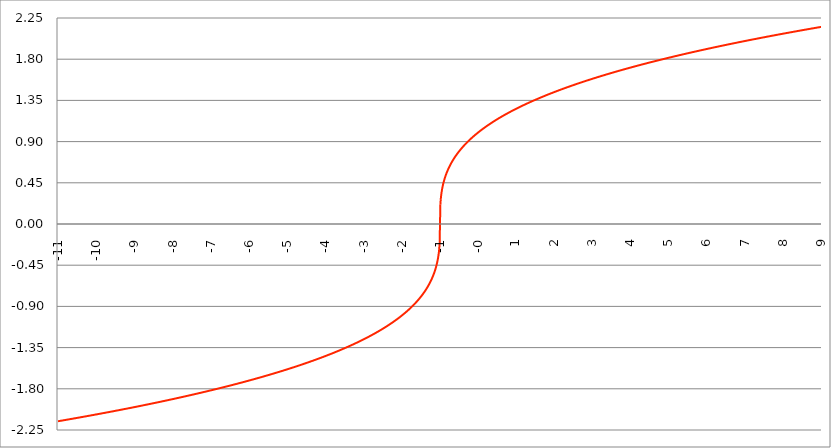
| Category | Series 1 |
|---|---|
| -11.0 | -2.154 |
| -10.99 | -2.154 |
| -10.98 | -2.153 |
| -10.97 | -2.152 |
| -10.96 | -2.152 |
| -10.95 | -2.151 |
| -10.94 | -2.15 |
| -10.93 | -2.149 |
| -10.92 | -2.149 |
| -10.91 | -2.148 |
| -10.9 | -2.147 |
| -10.89 | -2.147 |
| -10.88 | -2.146 |
| -10.87 | -2.145 |
| -10.86 | -2.144 |
| -10.85 | -2.144 |
| -10.84 | -2.143 |
| -10.83 | -2.142 |
| -10.82 | -2.141 |
| -10.81 | -2.141 |
| -10.8 | -2.14 |
| -10.79 | -2.139 |
| -10.78 | -2.139 |
| -10.77 | -2.138 |
| -10.76000000000001 | -2.137 |
| -10.75000000000001 | -2.136 |
| -10.74000000000001 | -2.136 |
| -10.73000000000001 | -2.135 |
| -10.72000000000001 | -2.134 |
| -10.71000000000001 | -2.133 |
| -10.70000000000001 | -2.133 |
| -10.69000000000001 | -2.132 |
| -10.68000000000001 | -2.131 |
| -10.67000000000001 | -2.13 |
| -10.66000000000001 | -2.13 |
| -10.65000000000001 | -2.129 |
| -10.64000000000001 | -2.128 |
| -10.63000000000001 | -2.128 |
| -10.62000000000001 | -2.127 |
| -10.61000000000001 | -2.126 |
| -10.60000000000001 | -2.125 |
| -10.59000000000001 | -2.125 |
| -10.58000000000001 | -2.124 |
| -10.57000000000001 | -2.123 |
| -10.56000000000001 | -2.122 |
| -10.55000000000001 | -2.122 |
| -10.54000000000001 | -2.121 |
| -10.53000000000001 | -2.12 |
| -10.52000000000001 | -2.119 |
| -10.51000000000001 | -2.119 |
| -10.50000000000001 | -2.118 |
| -10.49000000000001 | -2.117 |
| -10.48000000000001 | -2.116 |
| -10.47000000000001 | -2.116 |
| -10.46000000000001 | -2.115 |
| -10.45000000000001 | -2.114 |
| -10.44000000000001 | -2.113 |
| -10.43000000000001 | -2.113 |
| -10.42000000000001 | -2.112 |
| -10.41000000000001 | -2.111 |
| -10.40000000000001 | -2.11 |
| -10.39000000000001 | -2.11 |
| -10.38000000000001 | -2.109 |
| -10.37000000000001 | -2.108 |
| -10.36000000000001 | -2.107 |
| -10.35000000000001 | -2.107 |
| -10.34000000000001 | -2.106 |
| -10.33000000000001 | -2.105 |
| -10.32000000000001 | -2.104 |
| -10.31000000000001 | -2.104 |
| -10.30000000000001 | -2.103 |
| -10.29000000000002 | -2.102 |
| -10.28000000000002 | -2.101 |
| -10.27000000000002 | -2.101 |
| -10.26000000000002 | -2.1 |
| -10.25000000000002 | -2.099 |
| -10.24000000000002 | -2.098 |
| -10.23000000000002 | -2.098 |
| -10.22000000000002 | -2.097 |
| -10.21000000000002 | -2.096 |
| -10.20000000000002 | -2.095 |
| -10.19000000000002 | -2.095 |
| -10.18000000000002 | -2.094 |
| -10.17000000000002 | -2.093 |
| -10.16000000000002 | -2.092 |
| -10.15000000000002 | -2.092 |
| -10.14000000000002 | -2.091 |
| -10.13000000000002 | -2.09 |
| -10.12000000000002 | -2.089 |
| -10.11000000000002 | -2.089 |
| -10.10000000000002 | -2.088 |
| -10.09000000000002 | -2.087 |
| -10.08000000000002 | -2.086 |
| -10.07000000000002 | -2.085 |
| -10.06000000000002 | -2.085 |
| -10.05000000000002 | -2.084 |
| -10.04000000000002 | -2.083 |
| -10.03000000000002 | -2.082 |
| -10.02000000000002 | -2.082 |
| -10.01000000000002 | -2.081 |
| -10.00000000000002 | -2.08 |
| -9.990000000000022 | -2.079 |
| -9.980000000000022 | -2.079 |
| -9.97000000000002 | -2.078 |
| -9.960000000000022 | -2.077 |
| -9.950000000000022 | -2.076 |
| -9.940000000000023 | -2.075 |
| -9.930000000000023 | -2.075 |
| -9.920000000000023 | -2.074 |
| -9.910000000000023 | -2.073 |
| -9.900000000000023 | -2.072 |
| -9.890000000000024 | -2.072 |
| -9.880000000000024 | -2.071 |
| -9.870000000000024 | -2.07 |
| -9.860000000000024 | -2.069 |
| -9.850000000000025 | -2.068 |
| -9.840000000000025 | -2.068 |
| -9.830000000000025 | -2.067 |
| -9.820000000000025 | -2.066 |
| -9.810000000000025 | -2.065 |
| -9.800000000000026 | -2.065 |
| -9.790000000000026 | -2.064 |
| -9.780000000000026 | -2.063 |
| -9.770000000000026 | -2.062 |
| -9.760000000000026 | -2.061 |
| -9.750000000000027 | -2.061 |
| -9.740000000000027 | -2.06 |
| -9.730000000000027 | -2.059 |
| -9.720000000000027 | -2.058 |
| -9.710000000000027 | -2.057 |
| -9.700000000000028 | -2.057 |
| -9.690000000000028 | -2.056 |
| -9.680000000000028 | -2.055 |
| -9.670000000000028 | -2.054 |
| -9.660000000000029 | -2.054 |
| -9.650000000000029 | -2.053 |
| -9.640000000000029 | -2.052 |
| -9.63000000000003 | -2.051 |
| -9.62000000000003 | -2.05 |
| -9.61000000000003 | -2.05 |
| -9.60000000000003 | -2.049 |
| -9.59000000000003 | -2.048 |
| -9.58000000000003 | -2.047 |
| -9.57000000000003 | -2.046 |
| -9.56000000000003 | -2.046 |
| -9.55000000000003 | -2.045 |
| -9.540000000000031 | -2.044 |
| -9.530000000000031 | -2.043 |
| -9.520000000000032 | -2.042 |
| -9.510000000000032 | -2.042 |
| -9.50000000000003 | -2.041 |
| -9.490000000000032 | -2.04 |
| -9.480000000000032 | -2.039 |
| -9.470000000000033 | -2.038 |
| -9.460000000000033 | -2.038 |
| -9.450000000000033 | -2.037 |
| -9.440000000000033 | -2.036 |
| -9.430000000000033 | -2.035 |
| -9.420000000000034 | -2.034 |
| -9.410000000000032 | -2.034 |
| -9.400000000000034 | -2.033 |
| -9.390000000000034 | -2.032 |
| -9.380000000000035 | -2.031 |
| -9.370000000000035 | -2.03 |
| -9.360000000000033 | -2.03 |
| -9.350000000000035 | -2.029 |
| -9.340000000000035 | -2.028 |
| -9.330000000000036 | -2.027 |
| -9.320000000000036 | -2.026 |
| -9.310000000000034 | -2.026 |
| -9.300000000000036 | -2.025 |
| -9.290000000000036 | -2.024 |
| -9.280000000000037 | -2.023 |
| -9.270000000000037 | -2.022 |
| -9.260000000000037 | -2.021 |
| -9.250000000000037 | -2.021 |
| -9.240000000000038 | -2.02 |
| -9.230000000000038 | -2.019 |
| -9.220000000000038 | -2.018 |
| -9.210000000000038 | -2.017 |
| -9.200000000000038 | -2.017 |
| -9.190000000000039 | -2.016 |
| -9.180000000000039 | -2.015 |
| -9.170000000000037 | -2.014 |
| -9.16000000000004 | -2.013 |
| -9.15000000000004 | -2.012 |
| -9.14000000000004 | -2.012 |
| -9.13000000000004 | -2.011 |
| -9.12000000000004 | -2.01 |
| -9.11000000000004 | -2.009 |
| -9.10000000000004 | -2.008 |
| -9.09000000000004 | -2.007 |
| -9.08000000000004 | -2.007 |
| -9.07000000000004 | -2.006 |
| -9.06000000000004 | -2.005 |
| -9.05000000000004 | -2.004 |
| -9.040000000000042 | -2.003 |
| -9.03000000000004 | -2.002 |
| -9.020000000000042 | -2.002 |
| -9.010000000000042 | -2.001 |
| -9.000000000000043 | -2 |
| -8.990000000000043 | -1.999 |
| -8.980000000000043 | -1.998 |
| -8.970000000000043 | -1.997 |
| -8.960000000000043 | -1.997 |
| -8.950000000000044 | -1.996 |
| -8.940000000000042 | -1.995 |
| -8.930000000000044 | -1.994 |
| -8.920000000000044 | -1.993 |
| -8.910000000000045 | -1.992 |
| -8.900000000000045 | -1.992 |
| -8.890000000000043 | -1.991 |
| -8.880000000000045 | -1.99 |
| -8.870000000000045 | -1.989 |
| -8.860000000000046 | -1.988 |
| -8.850000000000046 | -1.987 |
| -8.840000000000044 | -1.987 |
| -8.830000000000046 | -1.986 |
| -8.820000000000046 | -1.985 |
| -8.810000000000047 | -1.984 |
| -8.800000000000045 | -1.983 |
| -8.790000000000047 | -1.982 |
| -8.780000000000047 | -1.981 |
| -8.770000000000048 | -1.981 |
| -8.760000000000048 | -1.98 |
| -8.750000000000046 | -1.979 |
| -8.740000000000048 | -1.978 |
| -8.730000000000048 | -1.977 |
| -8.720000000000049 | -1.976 |
| -8.710000000000049 | -1.976 |
| -8.700000000000047 | -1.975 |
| -8.69000000000005 | -1.974 |
| -8.68000000000005 | -1.973 |
| -8.67000000000005 | -1.972 |
| -8.66000000000005 | -1.971 |
| -8.65000000000005 | -1.97 |
| -8.64000000000005 | -1.97 |
| -8.63000000000005 | -1.969 |
| -8.62000000000005 | -1.968 |
| -8.610000000000051 | -1.967 |
| -8.600000000000051 | -1.966 |
| -8.590000000000051 | -1.965 |
| -8.580000000000052 | -1.964 |
| -8.570000000000052 | -1.964 |
| -8.560000000000052 | -1.963 |
| -8.550000000000052 | -1.962 |
| -8.540000000000052 | -1.961 |
| -8.530000000000053 | -1.96 |
| -8.520000000000053 | -1.959 |
| -8.510000000000053 | -1.958 |
| -8.500000000000053 | -1.957 |
| -8.490000000000054 | -1.957 |
| -8.480000000000054 | -1.956 |
| -8.470000000000052 | -1.955 |
| -8.460000000000054 | -1.954 |
| -8.450000000000054 | -1.953 |
| -8.440000000000055 | -1.952 |
| -8.430000000000055 | -1.951 |
| -8.420000000000055 | -1.95 |
| -8.410000000000055 | -1.95 |
| -8.400000000000055 | -1.949 |
| -8.390000000000056 | -1.948 |
| -8.380000000000056 | -1.947 |
| -8.370000000000056 | -1.946 |
| -8.360000000000056 | -1.945 |
| -8.350000000000056 | -1.944 |
| -8.340000000000057 | -1.943 |
| -8.330000000000057 | -1.943 |
| -8.320000000000057 | -1.942 |
| -8.310000000000057 | -1.941 |
| -8.300000000000058 | -1.94 |
| -8.290000000000058 | -1.939 |
| -8.280000000000058 | -1.938 |
| -8.270000000000058 | -1.937 |
| -8.260000000000058 | -1.936 |
| -8.250000000000059 | -1.935 |
| -8.240000000000059 | -1.935 |
| -8.230000000000059 | -1.934 |
| -8.22000000000006 | -1.933 |
| -8.21000000000006 | -1.932 |
| -8.20000000000006 | -1.931 |
| -8.19000000000006 | -1.93 |
| -8.18000000000006 | -1.929 |
| -8.17000000000006 | -1.928 |
| -8.16000000000006 | -1.927 |
| -8.15000000000006 | -1.926 |
| -8.140000000000061 | -1.926 |
| -8.130000000000061 | -1.925 |
| -8.120000000000061 | -1.924 |
| -8.110000000000062 | -1.923 |
| -8.100000000000062 | -1.922 |
| -8.090000000000062 | -1.921 |
| -8.080000000000062 | -1.92 |
| -8.070000000000062 | -1.919 |
| -8.060000000000063 | -1.918 |
| -8.050000000000063 | -1.917 |
| -8.040000000000063 | -1.917 |
| -8.030000000000063 | -1.916 |
| -8.020000000000064 | -1.915 |
| -8.010000000000064 | -1.914 |
| -8.000000000000062 | -1.913 |
| -7.990000000000064 | -1.912 |
| -7.980000000000064 | -1.911 |
| -7.970000000000064 | -1.91 |
| -7.960000000000064 | -1.909 |
| -7.950000000000064 | -1.908 |
| -7.940000000000065 | -1.907 |
| -7.930000000000065 | -1.907 |
| -7.920000000000065 | -1.906 |
| -7.910000000000065 | -1.905 |
| -7.900000000000066 | -1.904 |
| -7.890000000000066 | -1.903 |
| -7.880000000000066 | -1.902 |
| -7.870000000000066 | -1.901 |
| -7.860000000000067 | -1.9 |
| -7.850000000000067 | -1.899 |
| -7.840000000000067 | -1.898 |
| -7.830000000000067 | -1.897 |
| -7.820000000000068 | -1.896 |
| -7.810000000000068 | -1.895 |
| -7.800000000000068 | -1.895 |
| -7.790000000000068 | -1.894 |
| -7.780000000000068 | -1.893 |
| -7.770000000000068 | -1.892 |
| -7.760000000000069 | -1.891 |
| -7.75000000000007 | -1.89 |
| -7.74000000000007 | -1.889 |
| -7.73000000000007 | -1.888 |
| -7.72000000000007 | -1.887 |
| -7.71000000000007 | -1.886 |
| -7.70000000000007 | -1.885 |
| -7.69000000000007 | -1.884 |
| -7.680000000000071 | -1.883 |
| -7.670000000000071 | -1.882 |
| -7.660000000000071 | -1.881 |
| -7.650000000000071 | -1.881 |
| -7.640000000000072 | -1.88 |
| -7.630000000000072 | -1.879 |
| -7.620000000000072 | -1.878 |
| -7.610000000000072 | -1.877 |
| -7.600000000000072 | -1.876 |
| -7.590000000000073 | -1.875 |
| -7.580000000000073 | -1.874 |
| -7.570000000000073 | -1.873 |
| -7.560000000000073 | -1.872 |
| -7.550000000000074 | -1.871 |
| -7.540000000000074 | -1.87 |
| -7.530000000000074 | -1.869 |
| -7.520000000000074 | -1.868 |
| -7.510000000000074 | -1.867 |
| -7.500000000000074 | -1.866 |
| -7.490000000000074 | -1.865 |
| -7.480000000000074 | -1.864 |
| -7.470000000000075 | -1.863 |
| -7.460000000000075 | -1.862 |
| -7.450000000000075 | -1.861 |
| -7.440000000000075 | -1.86 |
| -7.430000000000076 | -1.86 |
| -7.420000000000076 | -1.859 |
| -7.410000000000076 | -1.858 |
| -7.400000000000076 | -1.857 |
| -7.390000000000077 | -1.856 |
| -7.380000000000077 | -1.855 |
| -7.370000000000077 | -1.854 |
| -7.360000000000078 | -1.853 |
| -7.350000000000078 | -1.852 |
| -7.340000000000078 | -1.851 |
| -7.330000000000078 | -1.85 |
| -7.320000000000078 | -1.849 |
| -7.310000000000079 | -1.848 |
| -7.300000000000079 | -1.847 |
| -7.29000000000008 | -1.846 |
| -7.28000000000008 | -1.845 |
| -7.27000000000008 | -1.844 |
| -7.26000000000008 | -1.843 |
| -7.25000000000008 | -1.842 |
| -7.24000000000008 | -1.841 |
| -7.23000000000008 | -1.84 |
| -7.220000000000081 | -1.839 |
| -7.210000000000081 | -1.838 |
| -7.200000000000081 | -1.837 |
| -7.190000000000081 | -1.836 |
| -7.180000000000081 | -1.835 |
| -7.170000000000082 | -1.834 |
| -7.160000000000082 | -1.833 |
| -7.150000000000082 | -1.832 |
| -7.140000000000082 | -1.831 |
| -7.130000000000082 | -1.83 |
| -7.120000000000083 | -1.829 |
| -7.110000000000083 | -1.828 |
| -7.100000000000083 | -1.827 |
| -7.090000000000083 | -1.826 |
| -7.080000000000084 | -1.825 |
| -7.070000000000084 | -1.824 |
| -7.060000000000084 | -1.823 |
| -7.050000000000084 | -1.822 |
| -7.040000000000084 | -1.821 |
| -7.030000000000084 | -1.82 |
| -7.020000000000085 | -1.819 |
| -7.010000000000085 | -1.818 |
| -7.000000000000085 | -1.817 |
| -6.990000000000085 | -1.816 |
| -6.980000000000085 | -1.815 |
| -6.970000000000085 | -1.814 |
| -6.960000000000086 | -1.813 |
| -6.950000000000086 | -1.812 |
| -6.940000000000086 | -1.811 |
| -6.930000000000086 | -1.81 |
| -6.920000000000087 | -1.809 |
| -6.910000000000087 | -1.808 |
| -6.900000000000087 | -1.807 |
| -6.890000000000088 | -1.806 |
| -6.880000000000088 | -1.805 |
| -6.870000000000088 | -1.804 |
| -6.860000000000088 | -1.803 |
| -6.850000000000088 | -1.802 |
| -6.840000000000089 | -1.801 |
| -6.830000000000089 | -1.8 |
| -6.820000000000089 | -1.799 |
| -6.810000000000089 | -1.798 |
| -6.800000000000089 | -1.797 |
| -6.79000000000009 | -1.796 |
| -6.78000000000009 | -1.795 |
| -6.77000000000009 | -1.794 |
| -6.76000000000009 | -1.793 |
| -6.750000000000091 | -1.792 |
| -6.740000000000091 | -1.79 |
| -6.730000000000091 | -1.789 |
| -6.720000000000091 | -1.788 |
| -6.710000000000091 | -1.787 |
| -6.700000000000092 | -1.786 |
| -6.690000000000092 | -1.785 |
| -6.680000000000092 | -1.784 |
| -6.670000000000092 | -1.783 |
| -6.660000000000092 | -1.782 |
| -6.650000000000093 | -1.781 |
| -6.640000000000093 | -1.78 |
| -6.630000000000093 | -1.779 |
| -6.620000000000093 | -1.778 |
| -6.610000000000093 | -1.777 |
| -6.600000000000094 | -1.776 |
| -6.590000000000094 | -1.775 |
| -6.580000000000094 | -1.774 |
| -6.570000000000094 | -1.773 |
| -6.560000000000095 | -1.772 |
| -6.550000000000095 | -1.771 |
| -6.540000000000095 | -1.769 |
| -6.530000000000095 | -1.768 |
| -6.520000000000095 | -1.767 |
| -6.510000000000096 | -1.766 |
| -6.500000000000096 | -1.765 |
| -6.490000000000096 | -1.764 |
| -6.480000000000096 | -1.763 |
| -6.470000000000096 | -1.762 |
| -6.460000000000097 | -1.761 |
| -6.450000000000097 | -1.76 |
| -6.440000000000097 | -1.759 |
| -6.430000000000097 | -1.758 |
| -6.420000000000098 | -1.757 |
| -6.410000000000098 | -1.755 |
| -6.400000000000098 | -1.754 |
| -6.390000000000098 | -1.753 |
| -6.380000000000098 | -1.752 |
| -6.370000000000099 | -1.751 |
| -6.360000000000099 | -1.75 |
| -6.350000000000099 | -1.749 |
| -6.340000000000099 | -1.748 |
| -6.330000000000099 | -1.747 |
| -6.3200000000001 | -1.746 |
| -6.3100000000001 | -1.745 |
| -6.3000000000001 | -1.744 |
| -6.2900000000001 | -1.742 |
| -6.2800000000001 | -1.741 |
| -6.2700000000001 | -1.74 |
| -6.260000000000101 | -1.739 |
| -6.250000000000101 | -1.738 |
| -6.240000000000101 | -1.737 |
| -6.230000000000101 | -1.736 |
| -6.220000000000102 | -1.735 |
| -6.210000000000102 | -1.734 |
| -6.200000000000102 | -1.732 |
| -6.190000000000103 | -1.731 |
| -6.180000000000103 | -1.73 |
| -6.170000000000103 | -1.729 |
| -6.160000000000103 | -1.728 |
| -6.150000000000103 | -1.727 |
| -6.140000000000104 | -1.726 |
| -6.130000000000104 | -1.725 |
| -6.120000000000104 | -1.724 |
| -6.110000000000104 | -1.722 |
| -6.100000000000104 | -1.721 |
| -6.090000000000104 | -1.72 |
| -6.080000000000104 | -1.719 |
| -6.070000000000105 | -1.718 |
| -6.060000000000105 | -1.717 |
| -6.050000000000105 | -1.716 |
| -6.040000000000105 | -1.715 |
| -6.030000000000105 | -1.713 |
| -6.020000000000106 | -1.712 |
| -6.010000000000106 | -1.711 |
| -6.000000000000106 | -1.71 |
| -5.990000000000106 | -1.709 |
| -5.980000000000106 | -1.708 |
| -5.970000000000107 | -1.707 |
| -5.960000000000107 | -1.705 |
| -5.950000000000107 | -1.704 |
| -5.940000000000107 | -1.703 |
| -5.930000000000108 | -1.702 |
| -5.920000000000108 | -1.701 |
| -5.910000000000108 | -1.7 |
| -5.900000000000108 | -1.698 |
| -5.890000000000109 | -1.697 |
| -5.88000000000011 | -1.696 |
| -5.87000000000011 | -1.695 |
| -5.86000000000011 | -1.694 |
| -5.85000000000011 | -1.693 |
| -5.84000000000011 | -1.692 |
| -5.83000000000011 | -1.69 |
| -5.82000000000011 | -1.689 |
| -5.810000000000111 | -1.688 |
| -5.800000000000111 | -1.687 |
| -5.790000000000111 | -1.686 |
| -5.780000000000111 | -1.685 |
| -5.770000000000111 | -1.683 |
| -5.760000000000112 | -1.682 |
| -5.750000000000112 | -1.681 |
| -5.740000000000112 | -1.68 |
| -5.730000000000112 | -1.679 |
| -5.720000000000112 | -1.677 |
| -5.710000000000113 | -1.676 |
| -5.700000000000113 | -1.675 |
| -5.690000000000113 | -1.674 |
| -5.680000000000113 | -1.673 |
| -5.670000000000114 | -1.671 |
| -5.660000000000114 | -1.67 |
| -5.650000000000114 | -1.669 |
| -5.640000000000114 | -1.668 |
| -5.630000000000114 | -1.667 |
| -5.620000000000115 | -1.666 |
| -5.610000000000115 | -1.664 |
| -5.600000000000115 | -1.663 |
| -5.590000000000115 | -1.662 |
| -5.580000000000115 | -1.661 |
| -5.570000000000115 | -1.659 |
| -5.560000000000116 | -1.658 |
| -5.550000000000116 | -1.657 |
| -5.540000000000116 | -1.656 |
| -5.530000000000116 | -1.655 |
| -5.520000000000117 | -1.653 |
| -5.510000000000117 | -1.652 |
| -5.500000000000117 | -1.651 |
| -5.490000000000117 | -1.65 |
| -5.480000000000117 | -1.649 |
| -5.470000000000117 | -1.647 |
| -5.460000000000118 | -1.646 |
| -5.450000000000118 | -1.645 |
| -5.440000000000118 | -1.644 |
| -5.430000000000118 | -1.642 |
| -5.420000000000119 | -1.641 |
| -5.41000000000012 | -1.64 |
| -5.40000000000012 | -1.639 |
| -5.39000000000012 | -1.637 |
| -5.38000000000012 | -1.636 |
| -5.37000000000012 | -1.635 |
| -5.36000000000012 | -1.634 |
| -5.35000000000012 | -1.632 |
| -5.34000000000012 | -1.631 |
| -5.33000000000012 | -1.63 |
| -5.320000000000121 | -1.629 |
| -5.310000000000121 | -1.627 |
| -5.300000000000121 | -1.626 |
| -5.290000000000121 | -1.625 |
| -5.280000000000121 | -1.624 |
| -5.270000000000122 | -1.622 |
| -5.260000000000122 | -1.621 |
| -5.250000000000122 | -1.62 |
| -5.240000000000122 | -1.619 |
| -5.230000000000122 | -1.617 |
| -5.220000000000123 | -1.616 |
| -5.210000000000123 | -1.615 |
| -5.200000000000123 | -1.613 |
| -5.190000000000124 | -1.612 |
| -5.180000000000124 | -1.611 |
| -5.170000000000124 | -1.61 |
| -5.160000000000124 | -1.608 |
| -5.150000000000124 | -1.607 |
| -5.140000000000124 | -1.606 |
| -5.130000000000125 | -1.604 |
| -5.120000000000125 | -1.603 |
| -5.110000000000125 | -1.602 |
| -5.100000000000125 | -1.601 |
| -5.090000000000125 | -1.599 |
| -5.080000000000126 | -1.598 |
| -5.070000000000126 | -1.597 |
| -5.060000000000126 | -1.595 |
| -5.050000000000126 | -1.594 |
| -5.040000000000127 | -1.593 |
| -5.030000000000127 | -1.591 |
| -5.020000000000127 | -1.59 |
| -5.010000000000127 | -1.589 |
| -5.000000000000127 | -1.587 |
| -4.990000000000128 | -1.586 |
| -4.980000000000128 | -1.585 |
| -4.970000000000128 | -1.583 |
| -4.960000000000128 | -1.582 |
| -4.950000000000128 | -1.581 |
| -4.94000000000013 | -1.579 |
| -4.93000000000013 | -1.578 |
| -4.92000000000013 | -1.577 |
| -4.91000000000013 | -1.575 |
| -4.90000000000013 | -1.574 |
| -4.89000000000013 | -1.573 |
| -4.88000000000013 | -1.571 |
| -4.87000000000013 | -1.57 |
| -4.860000000000131 | -1.569 |
| -4.850000000000131 | -1.567 |
| -4.840000000000131 | -1.566 |
| -4.830000000000131 | -1.565 |
| -4.820000000000132 | -1.563 |
| -4.810000000000132 | -1.562 |
| -4.800000000000132 | -1.56 |
| -4.790000000000132 | -1.559 |
| -4.780000000000132 | -1.558 |
| -4.770000000000132 | -1.556 |
| -4.760000000000133 | -1.555 |
| -4.750000000000133 | -1.554 |
| -4.740000000000133 | -1.552 |
| -4.730000000000133 | -1.551 |
| -4.720000000000134 | -1.549 |
| -4.710000000000134 | -1.548 |
| -4.700000000000134 | -1.547 |
| -4.690000000000134 | -1.545 |
| -4.680000000000134 | -1.544 |
| -4.670000000000134 | -1.542 |
| -4.660000000000135 | -1.541 |
| -4.650000000000135 | -1.54 |
| -4.640000000000135 | -1.538 |
| -4.630000000000135 | -1.537 |
| -4.620000000000136 | -1.535 |
| -4.610000000000136 | -1.534 |
| -4.600000000000136 | -1.533 |
| -4.590000000000136 | -1.531 |
| -4.580000000000136 | -1.53 |
| -4.570000000000137 | -1.528 |
| -4.560000000000137 | -1.527 |
| -4.550000000000137 | -1.525 |
| -4.540000000000137 | -1.524 |
| -4.530000000000137 | -1.523 |
| -4.520000000000138 | -1.521 |
| -4.510000000000138 | -1.52 |
| -4.500000000000138 | -1.518 |
| -4.490000000000138 | -1.517 |
| -4.480000000000138 | -1.515 |
| -4.47000000000014 | -1.514 |
| -4.46000000000014 | -1.512 |
| -4.45000000000014 | -1.511 |
| -4.44000000000014 | -1.51 |
| -4.43000000000014 | -1.508 |
| -4.42000000000014 | -1.507 |
| -4.41000000000014 | -1.505 |
| -4.40000000000014 | -1.504 |
| -4.390000000000141 | -1.502 |
| -4.380000000000141 | -1.501 |
| -4.370000000000141 | -1.499 |
| -4.360000000000141 | -1.498 |
| -4.350000000000142 | -1.496 |
| -4.340000000000142 | -1.495 |
| -4.330000000000142 | -1.493 |
| -4.320000000000142 | -1.492 |
| -4.310000000000143 | -1.49 |
| -4.300000000000143 | -1.489 |
| -4.290000000000143 | -1.487 |
| -4.280000000000143 | -1.486 |
| -4.270000000000143 | -1.484 |
| -4.260000000000144 | -1.483 |
| -4.250000000000144 | -1.481 |
| -4.240000000000144 | -1.48 |
| -4.230000000000144 | -1.478 |
| -4.220000000000144 | -1.477 |
| -4.210000000000144 | -1.475 |
| -4.200000000000144 | -1.474 |
| -4.190000000000145 | -1.472 |
| -4.180000000000145 | -1.471 |
| -4.170000000000145 | -1.469 |
| -4.160000000000146 | -1.467 |
| -4.150000000000146 | -1.466 |
| -4.140000000000146 | -1.464 |
| -4.130000000000146 | -1.463 |
| -4.120000000000147 | -1.461 |
| -4.110000000000147 | -1.46 |
| -4.100000000000147 | -1.458 |
| -4.090000000000147 | -1.457 |
| -4.080000000000147 | -1.455 |
| -4.070000000000147 | -1.453 |
| -4.060000000000148 | -1.452 |
| -4.050000000000148 | -1.45 |
| -4.040000000000148 | -1.449 |
| -4.030000000000148 | -1.447 |
| -4.020000000000149 | -1.445 |
| -4.010000000000149 | -1.444 |
| -4.00000000000015 | -1.442 |
| -3.990000000000149 | -1.441 |
| -3.98000000000015 | -1.439 |
| -3.97000000000015 | -1.437 |
| -3.96000000000015 | -1.436 |
| -3.95000000000015 | -1.434 |
| -3.94000000000015 | -1.433 |
| -3.930000000000151 | -1.431 |
| -3.920000000000151 | -1.429 |
| -3.910000000000151 | -1.428 |
| -3.900000000000151 | -1.426 |
| -3.890000000000151 | -1.424 |
| -3.880000000000152 | -1.423 |
| -3.870000000000152 | -1.421 |
| -3.860000000000152 | -1.419 |
| -3.850000000000152 | -1.418 |
| -3.840000000000153 | -1.416 |
| -3.830000000000153 | -1.414 |
| -3.820000000000153 | -1.413 |
| -3.810000000000153 | -1.411 |
| -3.800000000000153 | -1.409 |
| -3.790000000000154 | -1.408 |
| -3.780000000000154 | -1.406 |
| -3.770000000000154 | -1.404 |
| -3.760000000000154 | -1.403 |
| -3.750000000000154 | -1.401 |
| -3.740000000000155 | -1.399 |
| -3.730000000000155 | -1.398 |
| -3.720000000000155 | -1.396 |
| -3.710000000000155 | -1.394 |
| -3.700000000000156 | -1.392 |
| -3.690000000000156 | -1.391 |
| -3.680000000000156 | -1.389 |
| -3.670000000000156 | -1.387 |
| -3.660000000000156 | -1.386 |
| -3.650000000000157 | -1.384 |
| -3.640000000000157 | -1.382 |
| -3.630000000000157 | -1.38 |
| -3.620000000000157 | -1.379 |
| -3.610000000000157 | -1.377 |
| -3.600000000000158 | -1.375 |
| -3.590000000000158 | -1.373 |
| -3.580000000000158 | -1.372 |
| -3.570000000000158 | -1.37 |
| -3.560000000000159 | -1.368 |
| -3.550000000000159 | -1.366 |
| -3.54000000000016 | -1.364 |
| -3.530000000000159 | -1.363 |
| -3.520000000000159 | -1.361 |
| -3.51000000000016 | -1.359 |
| -3.50000000000016 | -1.357 |
| -3.49000000000016 | -1.355 |
| -3.48000000000016 | -1.354 |
| -3.47000000000016 | -1.352 |
| -3.460000000000161 | -1.35 |
| -3.450000000000161 | -1.348 |
| -3.440000000000161 | -1.346 |
| -3.430000000000161 | -1.344 |
| -3.420000000000162 | -1.343 |
| -3.410000000000162 | -1.341 |
| -3.400000000000162 | -1.339 |
| -3.390000000000162 | -1.337 |
| -3.380000000000162 | -1.335 |
| -3.370000000000163 | -1.333 |
| -3.360000000000163 | -1.331 |
| -3.350000000000163 | -1.33 |
| -3.340000000000163 | -1.328 |
| -3.330000000000163 | -1.326 |
| -3.320000000000164 | -1.324 |
| -3.310000000000164 | -1.322 |
| -3.300000000000164 | -1.32 |
| -3.290000000000164 | -1.318 |
| -3.280000000000165 | -1.316 |
| -3.270000000000165 | -1.314 |
| -3.260000000000165 | -1.312 |
| -3.250000000000165 | -1.31 |
| -3.240000000000165 | -1.308 |
| -3.230000000000166 | -1.306 |
| -3.220000000000166 | -1.305 |
| -3.210000000000166 | -1.303 |
| -3.200000000000166 | -1.301 |
| -3.190000000000166 | -1.299 |
| -3.180000000000167 | -1.297 |
| -3.170000000000167 | -1.295 |
| -3.160000000000167 | -1.293 |
| -3.150000000000167 | -1.291 |
| -3.140000000000168 | -1.289 |
| -3.130000000000168 | -1.287 |
| -3.120000000000168 | -1.285 |
| -3.110000000000168 | -1.283 |
| -3.100000000000168 | -1.281 |
| -3.090000000000169 | -1.279 |
| -3.080000000000169 | -1.277 |
| -3.070000000000169 | -1.274 |
| -3.060000000000169 | -1.272 |
| -3.050000000000169 | -1.27 |
| -3.04000000000017 | -1.268 |
| -3.03000000000017 | -1.266 |
| -3.02000000000017 | -1.264 |
| -3.01000000000017 | -1.262 |
| -3.000000000000171 | -1.26 |
| -2.990000000000171 | -1.258 |
| -2.980000000000171 | -1.256 |
| -2.970000000000171 | -1.254 |
| -2.960000000000171 | -1.251 |
| -2.950000000000172 | -1.249 |
| -2.940000000000172 | -1.247 |
| -2.930000000000172 | -1.245 |
| -2.920000000000172 | -1.243 |
| -2.910000000000172 | -1.241 |
| -2.900000000000173 | -1.239 |
| -2.890000000000173 | -1.236 |
| -2.880000000000173 | -1.234 |
| -2.870000000000173 | -1.232 |
| -2.860000000000173 | -1.23 |
| -2.850000000000174 | -1.228 |
| -2.840000000000174 | -1.225 |
| -2.830000000000174 | -1.223 |
| -2.820000000000174 | -1.221 |
| -2.810000000000175 | -1.219 |
| -2.800000000000175 | -1.216 |
| -2.790000000000175 | -1.214 |
| -2.780000000000175 | -1.212 |
| -2.770000000000175 | -1.21 |
| -2.760000000000176 | -1.207 |
| -2.750000000000176 | -1.205 |
| -2.740000000000176 | -1.203 |
| -2.730000000000176 | -1.2 |
| -2.720000000000176 | -1.198 |
| -2.710000000000177 | -1.196 |
| -2.700000000000177 | -1.193 |
| -2.690000000000177 | -1.191 |
| -2.680000000000177 | -1.189 |
| -2.670000000000177 | -1.186 |
| -2.660000000000178 | -1.184 |
| -2.650000000000178 | -1.182 |
| -2.640000000000178 | -1.179 |
| -2.630000000000178 | -1.177 |
| -2.620000000000179 | -1.174 |
| -2.610000000000179 | -1.172 |
| -2.600000000000179 | -1.17 |
| -2.590000000000179 | -1.167 |
| -2.580000000000179 | -1.165 |
| -2.57000000000018 | -1.162 |
| -2.56000000000018 | -1.16 |
| -2.55000000000018 | -1.157 |
| -2.54000000000018 | -1.155 |
| -2.530000000000181 | -1.152 |
| -2.520000000000181 | -1.15 |
| -2.510000000000181 | -1.147 |
| -2.500000000000181 | -1.145 |
| -2.490000000000181 | -1.142 |
| -2.480000000000182 | -1.14 |
| -2.470000000000182 | -1.137 |
| -2.460000000000182 | -1.134 |
| -2.450000000000182 | -1.132 |
| -2.440000000000182 | -1.129 |
| -2.430000000000183 | -1.127 |
| -2.420000000000183 | -1.124 |
| -2.410000000000183 | -1.121 |
| -2.400000000000183 | -1.119 |
| -2.390000000000183 | -1.116 |
| -2.380000000000184 | -1.113 |
| -2.370000000000184 | -1.111 |
| -2.360000000000184 | -1.108 |
| -2.350000000000184 | -1.105 |
| -2.340000000000185 | -1.102 |
| -2.330000000000185 | -1.1 |
| -2.320000000000185 | -1.097 |
| -2.310000000000185 | -1.094 |
| -2.300000000000185 | -1.091 |
| -2.290000000000186 | -1.089 |
| -2.280000000000186 | -1.086 |
| -2.270000000000186 | -1.083 |
| -2.260000000000186 | -1.08 |
| -2.250000000000186 | -1.077 |
| -2.240000000000187 | -1.074 |
| -2.230000000000187 | -1.071 |
| -2.220000000000187 | -1.069 |
| -2.210000000000187 | -1.066 |
| -2.200000000000188 | -1.063 |
| -2.190000000000188 | -1.06 |
| -2.180000000000188 | -1.057 |
| -2.170000000000188 | -1.054 |
| -2.160000000000188 | -1.051 |
| -2.150000000000189 | -1.048 |
| -2.140000000000189 | -1.045 |
| -2.130000000000189 | -1.042 |
| -2.120000000000189 | -1.038 |
| -2.110000000000189 | -1.035 |
| -2.10000000000019 | -1.032 |
| -2.09000000000019 | -1.029 |
| -2.08000000000019 | -1.026 |
| -2.07000000000019 | -1.023 |
| -2.060000000000191 | -1.02 |
| -2.050000000000191 | -1.016 |
| -2.040000000000191 | -1.013 |
| -2.030000000000191 | -1.01 |
| -2.020000000000191 | -1.007 |
| -2.010000000000192 | -1.003 |
| -2.000000000000192 | -1 |
| -1.990000000000192 | -0.997 |
| -1.980000000000192 | -0.993 |
| -1.970000000000192 | -0.99 |
| -1.960000000000192 | -0.986 |
| -1.950000000000192 | -0.983 |
| -1.940000000000192 | -0.98 |
| -1.930000000000192 | -0.976 |
| -1.920000000000192 | -0.973 |
| -1.910000000000192 | -0.969 |
| -1.900000000000192 | -0.965 |
| -1.890000000000192 | -0.962 |
| -1.880000000000192 | -0.958 |
| -1.870000000000192 | -0.955 |
| -1.860000000000192 | -0.951 |
| -1.850000000000192 | -0.947 |
| -1.840000000000192 | -0.944 |
| -1.830000000000192 | -0.94 |
| -1.820000000000192 | -0.936 |
| -1.810000000000192 | -0.932 |
| -1.800000000000192 | -0.928 |
| -1.790000000000192 | -0.924 |
| -1.780000000000192 | -0.921 |
| -1.770000000000192 | -0.917 |
| -1.760000000000192 | -0.913 |
| -1.750000000000192 | -0.909 |
| -1.740000000000192 | -0.905 |
| -1.730000000000192 | -0.9 |
| -1.720000000000192 | -0.896 |
| -1.710000000000192 | -0.892 |
| -1.700000000000192 | -0.888 |
| -1.690000000000191 | -0.884 |
| -1.680000000000191 | -0.879 |
| -1.670000000000191 | -0.875 |
| -1.660000000000191 | -0.871 |
| -1.650000000000191 | -0.866 |
| -1.640000000000191 | -0.862 |
| -1.630000000000191 | -0.857 |
| -1.620000000000191 | -0.853 |
| -1.610000000000191 | -0.848 |
| -1.600000000000191 | -0.843 |
| -1.590000000000191 | -0.839 |
| -1.580000000000191 | -0.834 |
| -1.570000000000191 | -0.829 |
| -1.560000000000191 | -0.824 |
| -1.550000000000191 | -0.819 |
| -1.540000000000191 | -0.814 |
| -1.530000000000191 | -0.809 |
| -1.520000000000191 | -0.804 |
| -1.510000000000191 | -0.799 |
| -1.500000000000191 | -0.794 |
| -1.490000000000191 | -0.788 |
| -1.480000000000191 | -0.783 |
| -1.470000000000191 | -0.777 |
| -1.460000000000191 | -0.772 |
| -1.450000000000191 | -0.766 |
| -1.440000000000191 | -0.761 |
| -1.430000000000191 | -0.755 |
| -1.420000000000191 | -0.749 |
| -1.410000000000191 | -0.743 |
| -1.400000000000191 | -0.737 |
| -1.390000000000191 | -0.731 |
| -1.380000000000191 | -0.724 |
| -1.370000000000191 | -0.718 |
| -1.360000000000191 | -0.711 |
| -1.350000000000191 | -0.705 |
| -1.340000000000191 | -0.698 |
| -1.330000000000191 | -0.691 |
| -1.320000000000191 | -0.684 |
| -1.310000000000191 | -0.677 |
| -1.300000000000191 | -0.669 |
| -1.290000000000191 | -0.662 |
| -1.280000000000191 | -0.654 |
| -1.270000000000191 | -0.646 |
| -1.260000000000191 | -0.638 |
| -1.250000000000191 | -0.63 |
| -1.240000000000191 | -0.621 |
| -1.230000000000191 | -0.613 |
| -1.220000000000191 | -0.604 |
| -1.210000000000191 | -0.594 |
| -1.200000000000191 | -0.585 |
| -1.190000000000191 | -0.575 |
| -1.180000000000191 | -0.565 |
| -1.170000000000191 | -0.554 |
| -1.160000000000191 | -0.543 |
| -1.150000000000191 | -0.531 |
| -1.140000000000191 | -0.519 |
| -1.130000000000191 | -0.507 |
| -1.120000000000191 | -0.493 |
| -1.110000000000191 | -0.479 |
| -1.100000000000191 | -0.464 |
| -1.090000000000191 | -0.448 |
| -1.080000000000191 | -0.431 |
| -1.070000000000191 | -0.412 |
| -1.060000000000191 | -0.391 |
| -1.050000000000191 | -0.368 |
| -1.040000000000191 | -0.342 |
| -1.030000000000191 | -0.311 |
| -1.020000000000191 | -0.271 |
| -1.010000000000191 | -0.215 |
| -1.000000000000191 | 0 |
| -0.990000000000191 | 0.215 |
| -0.980000000000191 | 0.271 |
| -0.970000000000191 | 0.311 |
| -0.960000000000191 | 0.342 |
| -0.950000000000191 | 0.368 |
| -0.940000000000191 | 0.391 |
| -0.930000000000191 | 0.412 |
| -0.920000000000191 | 0.431 |
| -0.910000000000191 | 0.448 |
| -0.900000000000191 | 0.464 |
| -0.890000000000191 | 0.479 |
| -0.880000000000191 | 0.493 |
| -0.870000000000191 | 0.507 |
| -0.860000000000191 | 0.519 |
| -0.850000000000191 | 0.531 |
| -0.840000000000191 | 0.543 |
| -0.830000000000191 | 0.554 |
| -0.820000000000191 | 0.565 |
| -0.810000000000191 | 0.575 |
| -0.800000000000191 | 0.585 |
| -0.790000000000191 | 0.594 |
| -0.780000000000191 | 0.604 |
| -0.770000000000191 | 0.613 |
| -0.760000000000191 | 0.621 |
| -0.750000000000191 | 0.63 |
| -0.740000000000191 | 0.638 |
| -0.730000000000191 | 0.646 |
| -0.720000000000191 | 0.654 |
| -0.710000000000191 | 0.662 |
| -0.700000000000191 | 0.669 |
| -0.690000000000191 | 0.677 |
| -0.680000000000191 | 0.684 |
| -0.670000000000191 | 0.691 |
| -0.660000000000191 | 0.698 |
| -0.650000000000191 | 0.705 |
| -0.640000000000191 | 0.711 |
| -0.630000000000191 | 0.718 |
| -0.620000000000191 | 0.724 |
| -0.610000000000191 | 0.731 |
| -0.600000000000191 | 0.737 |
| -0.590000000000191 | 0.743 |
| -0.580000000000191 | 0.749 |
| -0.570000000000191 | 0.755 |
| -0.560000000000191 | 0.761 |
| -0.550000000000191 | 0.766 |
| -0.540000000000191 | 0.772 |
| -0.530000000000191 | 0.777 |
| -0.520000000000191 | 0.783 |
| -0.510000000000191 | 0.788 |
| -0.500000000000191 | 0.794 |
| -0.49000000000019 | 0.799 |
| -0.48000000000019 | 0.804 |
| -0.47000000000019 | 0.809 |
| -0.46000000000019 | 0.814 |
| -0.45000000000019 | 0.819 |
| -0.44000000000019 | 0.824 |
| -0.43000000000019 | 0.829 |
| -0.42000000000019 | 0.834 |
| -0.41000000000019 | 0.839 |
| -0.40000000000019 | 0.843 |
| -0.39000000000019 | 0.848 |
| -0.38000000000019 | 0.853 |
| -0.37000000000019 | 0.857 |
| -0.36000000000019 | 0.862 |
| -0.35000000000019 | 0.866 |
| -0.34000000000019 | 0.871 |
| -0.33000000000019 | 0.875 |
| -0.32000000000019 | 0.879 |
| -0.31000000000019 | 0.884 |
| -0.30000000000019 | 0.888 |
| -0.29000000000019 | 0.892 |
| -0.28000000000019 | 0.896 |
| -0.27000000000019 | 0.9 |
| -0.26000000000019 | 0.905 |
| -0.25000000000019 | 0.909 |
| -0.24000000000019 | 0.913 |
| -0.23000000000019 | 0.917 |
| -0.22000000000019 | 0.921 |
| -0.21000000000019 | 0.924 |
| -0.20000000000019 | 0.928 |
| -0.19000000000019 | 0.932 |
| -0.18000000000019 | 0.936 |
| -0.17000000000019 | 0.94 |
| -0.16000000000019 | 0.944 |
| -0.15000000000019 | 0.947 |
| -0.14000000000019 | 0.951 |
| -0.13000000000019 | 0.955 |
| -0.12000000000019 | 0.958 |
| -0.11000000000019 | 0.962 |
| -0.10000000000019 | 0.965 |
| -0.0900000000001902 | 0.969 |
| -0.0800000000001902 | 0.973 |
| -0.0700000000001902 | 0.976 |
| -0.0600000000001902 | 0.98 |
| -0.0500000000001902 | 0.983 |
| -0.0400000000001902 | 0.986 |
| -0.0300000000001902 | 0.99 |
| -0.0200000000001902 | 0.993 |
| -0.0100000000001902 | 0.997 |
| -1.90205490246953e-13 | 1 |
| 0.00999999999980979 | 1.003 |
| 0.0199999999998098 | 1.007 |
| 0.0299999999998098 | 1.01 |
| 0.0399999999998098 | 1.013 |
| 0.0499999999998098 | 1.016 |
| 0.0599999999998098 | 1.02 |
| 0.0699999999998098 | 1.023 |
| 0.0799999999998098 | 1.026 |
| 0.0899999999998098 | 1.029 |
| 0.0999999999998098 | 1.032 |
| 0.10999999999981 | 1.035 |
| 0.11999999999981 | 1.038 |
| 0.12999999999981 | 1.042 |
| 0.13999999999981 | 1.045 |
| 0.14999999999981 | 1.048 |
| 0.15999999999981 | 1.051 |
| 0.16999999999981 | 1.054 |
| 0.17999999999981 | 1.057 |
| 0.18999999999981 | 1.06 |
| 0.19999999999981 | 1.063 |
| 0.20999999999981 | 1.066 |
| 0.21999999999981 | 1.069 |
| 0.22999999999981 | 1.071 |
| 0.23999999999981 | 1.074 |
| 0.24999999999981 | 1.077 |
| 0.25999999999981 | 1.08 |
| 0.26999999999981 | 1.083 |
| 0.27999999999981 | 1.086 |
| 0.28999999999981 | 1.089 |
| 0.29999999999981 | 1.091 |
| 0.30999999999981 | 1.094 |
| 0.31999999999981 | 1.097 |
| 0.32999999999981 | 1.1 |
| 0.33999999999981 | 1.102 |
| 0.34999999999981 | 1.105 |
| 0.35999999999981 | 1.108 |
| 0.36999999999981 | 1.111 |
| 0.37999999999981 | 1.113 |
| 0.38999999999981 | 1.116 |
| 0.39999999999981 | 1.119 |
| 0.40999999999981 | 1.121 |
| 0.41999999999981 | 1.124 |
| 0.42999999999981 | 1.127 |
| 0.43999999999981 | 1.129 |
| 0.44999999999981 | 1.132 |
| 0.45999999999981 | 1.134 |
| 0.46999999999981 | 1.137 |
| 0.47999999999981 | 1.14 |
| 0.48999999999981 | 1.142 |
| 0.49999999999981 | 1.145 |
| 0.50999999999981 | 1.147 |
| 0.51999999999981 | 1.15 |
| 0.52999999999981 | 1.152 |
| 0.53999999999981 | 1.155 |
| 0.54999999999981 | 1.157 |
| 0.55999999999981 | 1.16 |
| 0.56999999999981 | 1.162 |
| 0.57999999999981 | 1.165 |
| 0.58999999999981 | 1.167 |
| 0.59999999999981 | 1.17 |
| 0.60999999999981 | 1.172 |
| 0.61999999999981 | 1.174 |
| 0.62999999999981 | 1.177 |
| 0.63999999999981 | 1.179 |
| 0.64999999999981 | 1.182 |
| 0.65999999999981 | 1.184 |
| 0.66999999999981 | 1.186 |
| 0.67999999999981 | 1.189 |
| 0.68999999999981 | 1.191 |
| 0.69999999999981 | 1.193 |
| 0.70999999999981 | 1.196 |
| 0.71999999999981 | 1.198 |
| 0.72999999999981 | 1.2 |
| 0.73999999999981 | 1.203 |
| 0.74999999999981 | 1.205 |
| 0.75999999999981 | 1.207 |
| 0.76999999999981 | 1.21 |
| 0.77999999999981 | 1.212 |
| 0.78999999999981 | 1.214 |
| 0.79999999999981 | 1.216 |
| 0.80999999999981 | 1.219 |
| 0.81999999999981 | 1.221 |
| 0.82999999999981 | 1.223 |
| 0.83999999999981 | 1.225 |
| 0.84999999999981 | 1.228 |
| 0.85999999999981 | 1.23 |
| 0.86999999999981 | 1.232 |
| 0.87999999999981 | 1.234 |
| 0.88999999999981 | 1.236 |
| 0.89999999999981 | 1.239 |
| 0.90999999999981 | 1.241 |
| 0.91999999999981 | 1.243 |
| 0.92999999999981 | 1.245 |
| 0.93999999999981 | 1.247 |
| 0.94999999999981 | 1.249 |
| 0.95999999999981 | 1.251 |
| 0.96999999999981 | 1.254 |
| 0.97999999999981 | 1.256 |
| 0.98999999999981 | 1.258 |
| 0.99999999999981 | 1.26 |
| 1.00999999999981 | 1.262 |
| 1.01999999999981 | 1.264 |
| 1.02999999999981 | 1.266 |
| 1.03999999999981 | 1.268 |
| 1.04999999999981 | 1.27 |
| 1.05999999999981 | 1.272 |
| 1.06999999999981 | 1.274 |
| 1.07999999999981 | 1.277 |
| 1.08999999999981 | 1.279 |
| 1.09999999999981 | 1.281 |
| 1.10999999999981 | 1.283 |
| 1.11999999999981 | 1.285 |
| 1.12999999999981 | 1.287 |
| 1.13999999999981 | 1.289 |
| 1.14999999999981 | 1.291 |
| 1.15999999999981 | 1.293 |
| 1.169999999999811 | 1.295 |
| 1.179999999999811 | 1.297 |
| 1.189999999999811 | 1.299 |
| 1.199999999999811 | 1.301 |
| 1.209999999999811 | 1.303 |
| 1.219999999999811 | 1.305 |
| 1.229999999999811 | 1.306 |
| 1.239999999999811 | 1.308 |
| 1.249999999999811 | 1.31 |
| 1.259999999999811 | 1.312 |
| 1.269999999999811 | 1.314 |
| 1.279999999999811 | 1.316 |
| 1.289999999999811 | 1.318 |
| 1.299999999999811 | 1.32 |
| 1.309999999999811 | 1.322 |
| 1.319999999999811 | 1.324 |
| 1.329999999999811 | 1.326 |
| 1.339999999999811 | 1.328 |
| 1.349999999999811 | 1.33 |
| 1.359999999999811 | 1.331 |
| 1.369999999999811 | 1.333 |
| 1.379999999999811 | 1.335 |
| 1.389999999999811 | 1.337 |
| 1.399999999999811 | 1.339 |
| 1.409999999999811 | 1.341 |
| 1.419999999999811 | 1.343 |
| 1.429999999999811 | 1.344 |
| 1.439999999999811 | 1.346 |
| 1.449999999999811 | 1.348 |
| 1.459999999999811 | 1.35 |
| 1.469999999999811 | 1.352 |
| 1.479999999999811 | 1.354 |
| 1.489999999999811 | 1.355 |
| 1.499999999999811 | 1.357 |
| 1.509999999999811 | 1.359 |
| 1.519999999999811 | 1.361 |
| 1.529999999999811 | 1.363 |
| 1.539999999999811 | 1.364 |
| 1.549999999999811 | 1.366 |
| 1.559999999999811 | 1.368 |
| 1.569999999999811 | 1.37 |
| 1.579999999999811 | 1.372 |
| 1.589999999999811 | 1.373 |
| 1.599999999999811 | 1.375 |
| 1.609999999999811 | 1.377 |
| 1.619999999999811 | 1.379 |
| 1.629999999999811 | 1.38 |
| 1.639999999999811 | 1.382 |
| 1.649999999999811 | 1.384 |
| 1.659999999999811 | 1.386 |
| 1.669999999999811 | 1.387 |
| 1.679999999999811 | 1.389 |
| 1.689999999999811 | 1.391 |
| 1.699999999999811 | 1.392 |
| 1.709999999999811 | 1.394 |
| 1.719999999999811 | 1.396 |
| 1.729999999999811 | 1.398 |
| 1.739999999999811 | 1.399 |
| 1.749999999999811 | 1.401 |
| 1.759999999999811 | 1.403 |
| 1.769999999999811 | 1.404 |
| 1.779999999999811 | 1.406 |
| 1.789999999999811 | 1.408 |
| 1.799999999999811 | 1.409 |
| 1.809999999999811 | 1.411 |
| 1.819999999999811 | 1.413 |
| 1.829999999999811 | 1.414 |
| 1.839999999999811 | 1.416 |
| 1.849999999999811 | 1.418 |
| 1.859999999999811 | 1.419 |
| 1.869999999999811 | 1.421 |
| 1.879999999999811 | 1.423 |
| 1.889999999999811 | 1.424 |
| 1.899999999999811 | 1.426 |
| 1.909999999999811 | 1.428 |
| 1.919999999999811 | 1.429 |
| 1.929999999999811 | 1.431 |
| 1.939999999999811 | 1.433 |
| 1.949999999999811 | 1.434 |
| 1.959999999999811 | 1.436 |
| 1.969999999999811 | 1.437 |
| 1.979999999999811 | 1.439 |
| 1.989999999999811 | 1.441 |
| 1.999999999999811 | 1.442 |
| 2.009999999999811 | 1.444 |
| 2.019999999999811 | 1.445 |
| 2.029999999999811 | 1.447 |
| 2.03999999999981 | 1.449 |
| 2.04999999999981 | 1.45 |
| 2.05999999999981 | 1.452 |
| 2.06999999999981 | 1.453 |
| 2.07999999999981 | 1.455 |
| 2.089999999999809 | 1.457 |
| 2.099999999999809 | 1.458 |
| 2.109999999999809 | 1.46 |
| 2.119999999999809 | 1.461 |
| 2.129999999999808 | 1.463 |
| 2.139999999999808 | 1.464 |
| 2.149999999999808 | 1.466 |
| 2.159999999999808 | 1.467 |
| 2.169999999999808 | 1.469 |
| 2.179999999999807 | 1.471 |
| 2.189999999999807 | 1.472 |
| 2.199999999999807 | 1.474 |
| 2.209999999999807 | 1.475 |
| 2.219999999999807 | 1.477 |
| 2.229999999999806 | 1.478 |
| 2.239999999999806 | 1.48 |
| 2.249999999999806 | 1.481 |
| 2.259999999999806 | 1.483 |
| 2.269999999999805 | 1.484 |
| 2.279999999999805 | 1.486 |
| 2.289999999999805 | 1.487 |
| 2.299999999999805 | 1.489 |
| 2.309999999999805 | 1.49 |
| 2.319999999999804 | 1.492 |
| 2.329999999999804 | 1.493 |
| 2.339999999999804 | 1.495 |
| 2.349999999999804 | 1.496 |
| 2.359999999999804 | 1.498 |
| 2.369999999999803 | 1.499 |
| 2.379999999999803 | 1.501 |
| 2.389999999999803 | 1.502 |
| 2.399999999999803 | 1.504 |
| 2.409999999999802 | 1.505 |
| 2.419999999999802 | 1.507 |
| 2.429999999999802 | 1.508 |
| 2.439999999999802 | 1.51 |
| 2.449999999999802 | 1.511 |
| 2.459999999999801 | 1.512 |
| 2.469999999999801 | 1.514 |
| 2.479999999999801 | 1.515 |
| 2.489999999999801 | 1.517 |
| 2.499999999999801 | 1.518 |
| 2.5099999999998 | 1.52 |
| 2.5199999999998 | 1.521 |
| 2.5299999999998 | 1.523 |
| 2.5399999999998 | 1.524 |
| 2.5499999999998 | 1.525 |
| 2.559999999999799 | 1.527 |
| 2.569999999999799 | 1.528 |
| 2.579999999999799 | 1.53 |
| 2.589999999999799 | 1.531 |
| 2.599999999999798 | 1.533 |
| 2.609999999999798 | 1.534 |
| 2.619999999999798 | 1.535 |
| 2.629999999999798 | 1.537 |
| 2.639999999999798 | 1.538 |
| 2.649999999999797 | 1.54 |
| 2.659999999999797 | 1.541 |
| 2.669999999999797 | 1.542 |
| 2.679999999999797 | 1.544 |
| 2.689999999999796 | 1.545 |
| 2.699999999999796 | 1.547 |
| 2.709999999999796 | 1.548 |
| 2.719999999999796 | 1.549 |
| 2.729999999999796 | 1.551 |
| 2.739999999999795 | 1.552 |
| 2.749999999999795 | 1.554 |
| 2.759999999999795 | 1.555 |
| 2.769999999999795 | 1.556 |
| 2.779999999999795 | 1.558 |
| 2.789999999999794 | 1.559 |
| 2.799999999999794 | 1.56 |
| 2.809999999999794 | 1.562 |
| 2.819999999999794 | 1.563 |
| 2.829999999999794 | 1.565 |
| 2.839999999999793 | 1.566 |
| 2.849999999999793 | 1.567 |
| 2.859999999999793 | 1.569 |
| 2.869999999999793 | 1.57 |
| 2.879999999999792 | 1.571 |
| 2.889999999999792 | 1.573 |
| 2.899999999999792 | 1.574 |
| 2.909999999999792 | 1.575 |
| 2.919999999999792 | 1.577 |
| 2.929999999999791 | 1.578 |
| 2.939999999999791 | 1.579 |
| 2.949999999999791 | 1.581 |
| 2.959999999999791 | 1.582 |
| 2.969999999999791 | 1.583 |
| 2.97999999999979 | 1.585 |
| 2.98999999999979 | 1.586 |
| 2.99999999999979 | 1.587 |
| 3.00999999999979 | 1.589 |
| 3.01999999999979 | 1.59 |
| 3.029999999999789 | 1.591 |
| 3.039999999999789 | 1.593 |
| 3.049999999999789 | 1.594 |
| 3.059999999999789 | 1.595 |
| 3.069999999999788 | 1.597 |
| 3.079999999999788 | 1.598 |
| 3.089999999999788 | 1.599 |
| 3.099999999999788 | 1.601 |
| 3.109999999999788 | 1.602 |
| 3.119999999999787 | 1.603 |
| 3.129999999999787 | 1.604 |
| 3.139999999999787 | 1.606 |
| 3.149999999999787 | 1.607 |
| 3.159999999999787 | 1.608 |
| 3.169999999999786 | 1.61 |
| 3.179999999999786 | 1.611 |
| 3.189999999999786 | 1.612 |
| 3.199999999999786 | 1.613 |
| 3.209999999999785 | 1.615 |
| 3.219999999999785 | 1.616 |
| 3.229999999999785 | 1.617 |
| 3.239999999999785 | 1.619 |
| 3.249999999999785 | 1.62 |
| 3.259999999999784 | 1.621 |
| 3.269999999999784 | 1.622 |
| 3.279999999999784 | 1.624 |
| 3.289999999999784 | 1.625 |
| 3.299999999999784 | 1.626 |
| 3.309999999999783 | 1.627 |
| 3.319999999999783 | 1.629 |
| 3.329999999999783 | 1.63 |
| 3.339999999999783 | 1.631 |
| 3.349999999999782 | 1.632 |
| 3.359999999999782 | 1.634 |
| 3.369999999999782 | 1.635 |
| 3.379999999999782 | 1.636 |
| 3.389999999999782 | 1.637 |
| 3.399999999999781 | 1.639 |
| 3.409999999999781 | 1.64 |
| 3.419999999999781 | 1.641 |
| 3.429999999999781 | 1.642 |
| 3.439999999999781 | 1.644 |
| 3.44999999999978 | 1.645 |
| 3.45999999999978 | 1.646 |
| 3.46999999999978 | 1.647 |
| 3.47999999999978 | 1.649 |
| 3.489999999999779 | 1.65 |
| 3.499999999999779 | 1.651 |
| 3.509999999999779 | 1.652 |
| 3.519999999999779 | 1.653 |
| 3.529999999999779 | 1.655 |
| 3.539999999999778 | 1.656 |
| 3.549999999999778 | 1.657 |
| 3.559999999999778 | 1.658 |
| 3.569999999999778 | 1.659 |
| 3.579999999999778 | 1.661 |
| 3.589999999999777 | 1.662 |
| 3.599999999999777 | 1.663 |
| 3.609999999999777 | 1.664 |
| 3.619999999999777 | 1.666 |
| 3.629999999999776 | 1.667 |
| 3.639999999999776 | 1.668 |
| 3.649999999999776 | 1.669 |
| 3.659999999999776 | 1.67 |
| 3.669999999999776 | 1.671 |
| 3.679999999999775 | 1.673 |
| 3.689999999999775 | 1.674 |
| 3.699999999999775 | 1.675 |
| 3.709999999999775 | 1.676 |
| 3.719999999999775 | 1.677 |
| 3.729999999999774 | 1.679 |
| 3.739999999999774 | 1.68 |
| 3.749999999999774 | 1.681 |
| 3.759999999999774 | 1.682 |
| 3.769999999999773 | 1.683 |
| 3.779999999999773 | 1.685 |
| 3.789999999999773 | 1.686 |
| 3.799999999999773 | 1.687 |
| 3.809999999999773 | 1.688 |
| 3.819999999999772 | 1.689 |
| 3.829999999999772 | 1.69 |
| 3.839999999999772 | 1.692 |
| 3.849999999999772 | 1.693 |
| 3.859999999999772 | 1.694 |
| 3.869999999999771 | 1.695 |
| 3.879999999999771 | 1.696 |
| 3.889999999999771 | 1.697 |
| 3.899999999999771 | 1.698 |
| 3.909999999999771 | 1.7 |
| 3.91999999999977 | 1.701 |
| 3.92999999999977 | 1.702 |
| 3.93999999999977 | 1.703 |
| 3.94999999999977 | 1.704 |
| 3.959999999999769 | 1.705 |
| 3.969999999999769 | 1.707 |
| 3.979999999999769 | 1.708 |
| 3.989999999999769 | 1.709 |
| 3.999999999999769 | 1.71 |
| 4.009999999999768 | 1.711 |
| 4.019999999999768 | 1.712 |
| 4.029999999999768 | 1.713 |
| 4.039999999999768 | 1.715 |
| 4.049999999999767 | 1.716 |
| 4.059999999999767 | 1.717 |
| 4.069999999999767 | 1.718 |
| 4.079999999999767 | 1.719 |
| 4.089999999999767 | 1.72 |
| 4.099999999999766 | 1.721 |
| 4.109999999999766 | 1.722 |
| 4.119999999999766 | 1.724 |
| 4.129999999999766 | 1.725 |
| 4.139999999999766 | 1.726 |
| 4.149999999999765 | 1.727 |
| 4.159999999999765 | 1.728 |
| 4.169999999999765 | 1.729 |
| 4.179999999999765 | 1.73 |
| 4.189999999999764 | 1.731 |
| 4.199999999999764 | 1.732 |
| 4.209999999999764 | 1.734 |
| 4.219999999999764 | 1.735 |
| 4.229999999999764 | 1.736 |
| 4.239999999999763 | 1.737 |
| 4.249999999999763 | 1.738 |
| 4.259999999999763 | 1.739 |
| 4.269999999999763 | 1.74 |
| 4.279999999999763 | 1.741 |
| 4.289999999999762 | 1.742 |
| 4.299999999999762 | 1.744 |
| 4.309999999999762 | 1.745 |
| 4.319999999999762 | 1.746 |
| 4.329999999999762 | 1.747 |
| 4.339999999999761 | 1.748 |
| 4.349999999999761 | 1.749 |
| 4.359999999999761 | 1.75 |
| 4.369999999999761 | 1.751 |
| 4.37999999999976 | 1.752 |
| 4.38999999999976 | 1.753 |
| 4.39999999999976 | 1.754 |
| 4.40999999999976 | 1.755 |
| 4.41999999999976 | 1.757 |
| 4.42999999999976 | 1.758 |
| 4.43999999999976 | 1.759 |
| 4.44999999999976 | 1.76 |
| 4.45999999999976 | 1.761 |
| 4.46999999999976 | 1.762 |
| 4.479999999999758 | 1.763 |
| 4.489999999999758 | 1.764 |
| 4.499999999999758 | 1.765 |
| 4.509999999999758 | 1.766 |
| 4.519999999999758 | 1.767 |
| 4.529999999999758 | 1.768 |
| 4.539999999999757 | 1.769 |
| 4.549999999999757 | 1.771 |
| 4.559999999999757 | 1.772 |
| 4.569999999999757 | 1.773 |
| 4.579999999999756 | 1.774 |
| 4.589999999999756 | 1.775 |
| 4.599999999999756 | 1.776 |
| 4.609999999999756 | 1.777 |
| 4.619999999999756 | 1.778 |
| 4.629999999999756 | 1.779 |
| 4.639999999999755 | 1.78 |
| 4.649999999999755 | 1.781 |
| 4.659999999999755 | 1.782 |
| 4.669999999999755 | 1.783 |
| 4.679999999999754 | 1.784 |
| 4.689999999999754 | 1.785 |
| 4.699999999999754 | 1.786 |
| 4.709999999999754 | 1.787 |
| 4.719999999999754 | 1.788 |
| 4.729999999999753 | 1.789 |
| 4.739999999999753 | 1.79 |
| 4.749999999999753 | 1.792 |
| 4.759999999999753 | 1.793 |
| 4.769999999999753 | 1.794 |
| 4.779999999999752 | 1.795 |
| 4.789999999999752 | 1.796 |
| 4.799999999999752 | 1.797 |
| 4.809999999999752 | 1.798 |
| 4.819999999999752 | 1.799 |
| 4.829999999999751 | 1.8 |
| 4.839999999999751 | 1.801 |
| 4.849999999999751 | 1.802 |
| 4.859999999999751 | 1.803 |
| 4.86999999999975 | 1.804 |
| 4.87999999999975 | 1.805 |
| 4.88999999999975 | 1.806 |
| 4.89999999999975 | 1.807 |
| 4.90999999999975 | 1.808 |
| 4.91999999999975 | 1.809 |
| 4.92999999999975 | 1.81 |
| 4.93999999999975 | 1.811 |
| 4.949999999999748 | 1.812 |
| 4.959999999999748 | 1.813 |
| 4.969999999999748 | 1.814 |
| 4.979999999999748 | 1.815 |
| 4.989999999999747 | 1.816 |
| 4.999999999999747 | 1.817 |
| 5.009999999999747 | 1.818 |
| 5.019999999999747 | 1.819 |
| 5.029999999999747 | 1.82 |
| 5.039999999999746 | 1.821 |
| 5.049999999999746 | 1.822 |
| 5.059999999999746 | 1.823 |
| 5.069999999999746 | 1.824 |
| 5.079999999999746 | 1.825 |
| 5.089999999999745 | 1.826 |
| 5.099999999999745 | 1.827 |
| 5.109999999999745 | 1.828 |
| 5.119999999999745 | 1.829 |
| 5.129999999999745 | 1.83 |
| 5.139999999999744 | 1.831 |
| 5.149999999999744 | 1.832 |
| 5.159999999999744 | 1.833 |
| 5.169999999999744 | 1.834 |
| 5.179999999999744 | 1.835 |
| 5.189999999999744 | 1.836 |
| 5.199999999999743 | 1.837 |
| 5.209999999999743 | 1.838 |
| 5.219999999999743 | 1.839 |
| 5.229999999999743 | 1.84 |
| 5.239999999999742 | 1.841 |
| 5.249999999999742 | 1.842 |
| 5.259999999999742 | 1.843 |
| 5.269999999999742 | 1.844 |
| 5.279999999999741 | 1.845 |
| 5.289999999999741 | 1.846 |
| 5.299999999999741 | 1.847 |
| 5.309999999999741 | 1.848 |
| 5.319999999999741 | 1.849 |
| 5.329999999999741 | 1.85 |
| 5.33999999999974 | 1.851 |
| 5.34999999999974 | 1.852 |
| 5.35999999999974 | 1.853 |
| 5.36999999999974 | 1.854 |
| 5.37999999999974 | 1.855 |
| 5.38999999999974 | 1.856 |
| 5.39999999999974 | 1.857 |
| 5.409999999999738 | 1.858 |
| 5.419999999999738 | 1.859 |
| 5.429999999999738 | 1.86 |
| 5.439999999999738 | 1.86 |
| 5.449999999999738 | 1.861 |
| 5.459999999999737 | 1.862 |
| 5.469999999999737 | 1.863 |
| 5.479999999999737 | 1.864 |
| 5.489999999999737 | 1.865 |
| 5.499999999999737 | 1.866 |
| 5.509999999999736 | 1.867 |
| 5.519999999999736 | 1.868 |
| 5.529999999999736 | 1.869 |
| 5.539999999999736 | 1.87 |
| 5.549999999999736 | 1.871 |
| 5.559999999999735 | 1.872 |
| 5.569999999999735 | 1.873 |
| 5.579999999999735 | 1.874 |
| 5.589999999999735 | 1.875 |
| 5.599999999999734 | 1.876 |
| 5.609999999999734 | 1.877 |
| 5.619999999999734 | 1.878 |
| 5.629999999999734 | 1.879 |
| 5.639999999999734 | 1.88 |
| 5.649999999999734 | 1.881 |
| 5.659999999999734 | 1.881 |
| 5.669999999999733 | 1.882 |
| 5.679999999999733 | 1.883 |
| 5.689999999999733 | 1.884 |
| 5.699999999999733 | 1.885 |
| 5.709999999999732 | 1.886 |
| 5.719999999999732 | 1.887 |
| 5.729999999999732 | 1.888 |
| 5.739999999999731 | 1.889 |
| 5.749999999999731 | 1.89 |
| 5.759999999999731 | 1.891 |
| 5.769999999999731 | 1.892 |
| 5.77999999999973 | 1.893 |
| 5.78999999999973 | 1.894 |
| 5.79999999999973 | 1.895 |
| 5.80999999999973 | 1.895 |
| 5.81999999999973 | 1.896 |
| 5.82999999999973 | 1.897 |
| 5.83999999999973 | 1.898 |
| 5.84999999999973 | 1.899 |
| 5.85999999999973 | 1.9 |
| 5.86999999999973 | 1.901 |
| 5.879999999999728 | 1.902 |
| 5.889999999999728 | 1.903 |
| 5.899999999999728 | 1.904 |
| 5.909999999999728 | 1.905 |
| 5.919999999999728 | 1.906 |
| 5.929999999999727 | 1.907 |
| 5.939999999999727 | 1.907 |
| 5.949999999999727 | 1.908 |
| 5.959999999999727 | 1.909 |
| 5.969999999999727 | 1.91 |
| 5.979999999999726 | 1.911 |
| 5.989999999999726 | 1.912 |
| 5.999999999999726 | 1.913 |
| 6.009999999999726 | 1.914 |
| 6.019999999999726 | 1.915 |
| 6.029999999999725 | 1.916 |
| 6.039999999999725 | 1.917 |
| 6.049999999999725 | 1.917 |
| 6.059999999999725 | 1.918 |
| 6.069999999999724 | 1.919 |
| 6.079999999999724 | 1.92 |
| 6.089999999999724 | 1.921 |
| 6.099999999999724 | 1.922 |
| 6.109999999999724 | 1.923 |
| 6.119999999999724 | 1.924 |
| 6.129999999999724 | 1.925 |
| 6.139999999999723 | 1.926 |
| 6.149999999999723 | 1.926 |
| 6.159999999999723 | 1.927 |
| 6.169999999999723 | 1.928 |
| 6.179999999999722 | 1.929 |
| 6.189999999999722 | 1.93 |
| 6.199999999999722 | 1.931 |
| 6.209999999999721 | 1.932 |
| 6.219999999999721 | 1.933 |
| 6.229999999999721 | 1.934 |
| 6.23999999999972 | 1.935 |
| 6.24999999999972 | 1.935 |
| 6.25999999999972 | 1.936 |
| 6.26999999999972 | 1.937 |
| 6.27999999999972 | 1.938 |
| 6.28999999999972 | 1.939 |
| 6.29999999999972 | 1.94 |
| 6.30999999999972 | 1.941 |
| 6.31999999999972 | 1.942 |
| 6.329999999999719 | 1.943 |
| 6.33999999999972 | 1.943 |
| 6.349999999999719 | 1.944 |
| 6.359999999999719 | 1.945 |
| 6.369999999999718 | 1.946 |
| 6.379999999999718 | 1.947 |
| 6.389999999999718 | 1.948 |
| 6.399999999999718 | 1.949 |
| 6.409999999999717 | 1.95 |
| 6.419999999999717 | 1.95 |
| 6.429999999999717 | 1.951 |
| 6.439999999999717 | 1.952 |
| 6.449999999999716 | 1.953 |
| 6.459999999999716 | 1.954 |
| 6.469999999999716 | 1.955 |
| 6.479999999999716 | 1.956 |
| 6.489999999999715 | 1.957 |
| 6.499999999999715 | 1.957 |
| 6.509999999999715 | 1.958 |
| 6.519999999999715 | 1.959 |
| 6.529999999999715 | 1.96 |
| 6.539999999999714 | 1.961 |
| 6.549999999999714 | 1.962 |
| 6.559999999999714 | 1.963 |
| 6.569999999999714 | 1.964 |
| 6.579999999999714 | 1.964 |
| 6.589999999999714 | 1.965 |
| 6.599999999999714 | 1.966 |
| 6.609999999999713 | 1.967 |
| 6.619999999999713 | 1.968 |
| 6.629999999999713 | 1.969 |
| 6.639999999999713 | 1.97 |
| 6.649999999999712 | 1.97 |
| 6.659999999999712 | 1.971 |
| 6.669999999999712 | 1.972 |
| 6.679999999999712 | 1.973 |
| 6.689999999999712 | 1.974 |
| 6.699999999999711 | 1.975 |
| 6.709999999999711 | 1.976 |
| 6.719999999999711 | 1.976 |
| 6.729999999999711 | 1.977 |
| 6.73999999999971 | 1.978 |
| 6.74999999999971 | 1.979 |
| 6.75999999999971 | 1.98 |
| 6.76999999999971 | 1.981 |
| 6.77999999999971 | 1.981 |
| 6.78999999999971 | 1.982 |
| 6.79999999999971 | 1.983 |
| 6.80999999999971 | 1.984 |
| 6.819999999999709 | 1.985 |
| 6.829999999999709 | 1.986 |
| 6.839999999999708 | 1.987 |
| 6.849999999999708 | 1.987 |
| 6.859999999999708 | 1.988 |
| 6.869999999999708 | 1.989 |
| 6.879999999999707 | 1.99 |
| 6.889999999999707 | 1.991 |
| 6.899999999999707 | 1.992 |
| 6.909999999999707 | 1.992 |
| 6.919999999999706 | 1.993 |
| 6.929999999999706 | 1.994 |
| 6.939999999999706 | 1.995 |
| 6.949999999999706 | 1.996 |
| 6.959999999999705 | 1.997 |
| 6.969999999999705 | 1.997 |
| 6.979999999999705 | 1.998 |
| 6.989999999999705 | 1.999 |
| 6.999999999999705 | 2 |
| 7.009999999999704 | 2.001 |
| 7.019999999999704 | 2.002 |
| 7.029999999999704 | 2.002 |
| 7.039999999999704 | 2.003 |
| 7.049999999999704 | 2.004 |
| 7.059999999999704 | 2.005 |
| 7.069999999999704 | 2.006 |
| 7.079999999999703 | 2.007 |
| 7.089999999999703 | 2.007 |
| 7.099999999999703 | 2.008 |
| 7.109999999999703 | 2.009 |
| 7.119999999999703 | 2.01 |
| 7.129999999999702 | 2.011 |
| 7.139999999999702 | 2.012 |
| 7.149999999999702 | 2.012 |
| 7.159999999999702 | 2.013 |
| 7.169999999999701 | 2.014 |
| 7.179999999999701 | 2.015 |
| 7.189999999999701 | 2.016 |
| 7.199999999999701 | 2.017 |
| 7.2099999999997 | 2.017 |
| 7.2199999999997 | 2.018 |
| 7.2299999999997 | 2.019 |
| 7.2399999999997 | 2.02 |
| 7.2499999999997 | 2.021 |
| 7.2599999999997 | 2.021 |
| 7.2699999999997 | 2.022 |
| 7.2799999999997 | 2.023 |
| 7.289999999999698 | 2.024 |
| 7.299999999999698 | 2.025 |
| 7.309999999999698 | 2.026 |
| 7.319999999999698 | 2.026 |
| 7.329999999999698 | 2.027 |
| 7.339999999999697 | 2.028 |
| 7.349999999999697 | 2.029 |
| 7.359999999999697 | 2.03 |
| 7.369999999999697 | 2.03 |
| 7.379999999999696 | 2.031 |
| 7.389999999999696 | 2.032 |
| 7.399999999999696 | 2.033 |
| 7.409999999999696 | 2.034 |
| 7.419999999999696 | 2.034 |
| 7.429999999999695 | 2.035 |
| 7.439999999999695 | 2.036 |
| 7.449999999999695 | 2.037 |
| 7.459999999999695 | 2.038 |
| 7.469999999999695 | 2.038 |
| 7.479999999999694 | 2.039 |
| 7.489999999999694 | 2.04 |
| 7.499999999999694 | 2.041 |
| 7.509999999999694 | 2.042 |
| 7.519999999999694 | 2.042 |
| 7.529999999999694 | 2.043 |
| 7.539999999999693 | 2.044 |
| 7.549999999999693 | 2.045 |
| 7.559999999999693 | 2.046 |
| 7.569999999999693 | 2.046 |
| 7.579999999999692 | 2.047 |
| 7.589999999999692 | 2.048 |
| 7.599999999999692 | 2.049 |
| 7.609999999999692 | 2.05 |
| 7.619999999999692 | 2.05 |
| 7.629999999999692 | 2.051 |
| 7.639999999999691 | 2.052 |
| 7.649999999999691 | 2.053 |
| 7.659999999999691 | 2.054 |
| 7.669999999999691 | 2.054 |
| 7.67999999999969 | 2.055 |
| 7.68999999999969 | 2.056 |
| 7.69999999999969 | 2.057 |
| 7.70999999999969 | 2.057 |
| 7.71999999999969 | 2.058 |
| 7.72999999999969 | 2.059 |
| 7.73999999999969 | 2.06 |
| 7.74999999999969 | 2.061 |
| 7.759999999999688 | 2.061 |
| 7.769999999999688 | 2.062 |
| 7.779999999999688 | 2.063 |
| 7.789999999999688 | 2.064 |
| 7.799999999999687 | 2.065 |
| 7.809999999999687 | 2.065 |
| 7.819999999999687 | 2.066 |
| 7.829999999999687 | 2.067 |
| 7.839999999999687 | 2.068 |
| 7.849999999999686 | 2.068 |
| 7.859999999999686 | 2.069 |
| 7.869999999999686 | 2.07 |
| 7.879999999999686 | 2.071 |
| 7.889999999999686 | 2.072 |
| 7.899999999999685 | 2.072 |
| 7.909999999999685 | 2.073 |
| 7.919999999999685 | 2.074 |
| 7.929999999999685 | 2.075 |
| 7.939999999999685 | 2.075 |
| 7.949999999999684 | 2.076 |
| 7.959999999999684 | 2.077 |
| 7.969999999999684 | 2.078 |
| 7.979999999999684 | 2.079 |
| 7.989999999999683 | 2.079 |
| 7.999999999999683 | 2.08 |
| 8.009999999999684 | 2.081 |
| 8.019999999999683 | 2.082 |
| 8.029999999999683 | 2.082 |
| 8.039999999999681 | 2.083 |
| 8.049999999999683 | 2.084 |
| 8.05999999999968 | 2.085 |
| 8.06999999999968 | 2.085 |
| 8.07999999999968 | 2.086 |
| 8.08999999999968 | 2.087 |
| 8.09999999999968 | 2.088 |
| 8.10999999999968 | 2.089 |
| 8.11999999999968 | 2.089 |
| 8.12999999999968 | 2.09 |
| 8.13999999999968 | 2.091 |
| 8.14999999999968 | 2.092 |
| 8.15999999999968 | 2.092 |
| 8.16999999999968 | 2.093 |
| 8.17999999999968 | 2.094 |
| 8.18999999999968 | 2.095 |
| 8.19999999999968 | 2.095 |
| 8.20999999999968 | 2.096 |
| 8.21999999999968 | 2.097 |
| 8.229999999999677 | 2.098 |
| 8.239999999999679 | 2.098 |
| 8.249999999999678 | 2.099 |
| 8.259999999999678 | 2.1 |
| 8.269999999999678 | 2.101 |
| 8.279999999999678 | 2.101 |
| 8.289999999999678 | 2.102 |
| 8.299999999999677 | 2.103 |
| 8.309999999999677 | 2.104 |
| 8.319999999999675 | 2.104 |
| 8.329999999999677 | 2.105 |
| 8.339999999999677 | 2.106 |
| 8.349999999999676 | 2.107 |
| 8.359999999999676 | 2.107 |
| 8.369999999999674 | 2.108 |
| 8.379999999999676 | 2.109 |
| 8.389999999999675 | 2.11 |
| 8.399999999999675 | 2.11 |
| 8.409999999999675 | 2.111 |
| 8.419999999999675 | 2.112 |
| 8.429999999999675 | 2.113 |
| 8.439999999999674 | 2.113 |
| 8.449999999999674 | 2.114 |
| 8.459999999999672 | 2.115 |
| 8.469999999999674 | 2.116 |
| 8.479999999999674 | 2.116 |
| 8.489999999999673 | 2.117 |
| 8.499999999999673 | 2.118 |
| 8.509999999999671 | 2.119 |
| 8.519999999999673 | 2.119 |
| 8.529999999999673 | 2.12 |
| 8.539999999999672 | 2.121 |
| 8.549999999999672 | 2.122 |
| 8.55999999999967 | 2.122 |
| 8.56999999999967 | 2.123 |
| 8.57999999999967 | 2.124 |
| 8.58999999999967 | 2.125 |
| 8.59999999999967 | 2.125 |
| 8.60999999999967 | 2.126 |
| 8.61999999999967 | 2.127 |
| 8.62999999999967 | 2.128 |
| 8.63999999999967 | 2.128 |
| 8.64999999999967 | 2.129 |
| 8.65999999999967 | 2.13 |
| 8.66999999999967 | 2.13 |
| 8.67999999999967 | 2.131 |
| 8.689999999999667 | 2.132 |
| 8.699999999999669 | 2.133 |
| 8.709999999999669 | 2.133 |
| 8.719999999999668 | 2.134 |
| 8.729999999999668 | 2.135 |
| 8.739999999999666 | 2.136 |
| 8.749999999999668 | 2.136 |
| 8.759999999999668 | 2.137 |
| 8.769999999999667 | 2.138 |
| 8.779999999999667 | 2.139 |
| 8.789999999999665 | 2.139 |
| 8.799999999999667 | 2.14 |
| 8.809999999999667 | 2.141 |
| 8.819999999999666 | 2.141 |
| 8.829999999999666 | 2.142 |
| 8.839999999999664 | 2.143 |
| 8.849999999999666 | 2.144 |
| 8.859999999999665 | 2.144 |
| 8.869999999999665 | 2.145 |
| 8.879999999999663 | 2.146 |
| 8.889999999999665 | 2.147 |
| 8.899999999999665 | 2.147 |
| 8.909999999999664 | 2.148 |
| 8.919999999999664 | 2.149 |
| 8.929999999999662 | 2.149 |
| 8.939999999999664 | 2.15 |
| 8.949999999999664 | 2.151 |
| 8.95999999999966 | 2.152 |
| 8.96999999999966 | 2.152 |
| 8.97999999999966 | 2.153 |
| 8.98999999999966 | 2.154 |
| 8.99999999999966 | 2.154 |